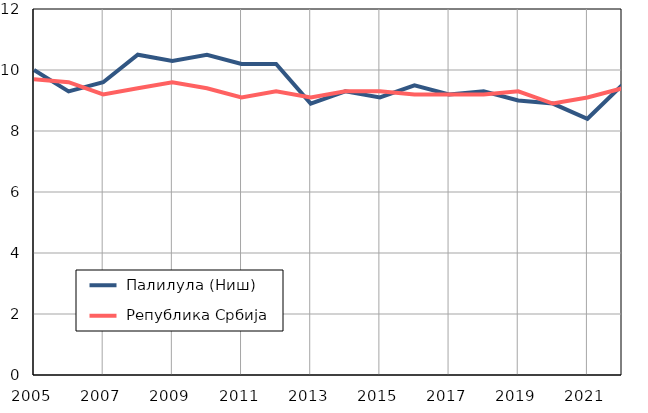
| Category |  Палилула (Ниш) |  Република Србија |
|---|---|---|
| 2005.0 | 10 | 9.7 |
| 2006.0 | 9.3 | 9.6 |
| 2007.0 | 9.6 | 9.2 |
| 2008.0 | 10.5 | 9.4 |
| 2009.0 | 10.3 | 9.6 |
| 2010.0 | 10.5 | 9.4 |
| 2011.0 | 10.2 | 9.1 |
| 2012.0 | 10.2 | 9.3 |
| 2013.0 | 8.9 | 9.1 |
| 2014.0 | 9.3 | 9.3 |
| 2015.0 | 9.1 | 9.3 |
| 2016.0 | 9.5 | 9.2 |
| 2017.0 | 9.2 | 9.2 |
| 2018.0 | 9.3 | 9.2 |
| 2019.0 | 9 | 9.3 |
| 2020.0 | 8.9 | 8.9 |
| 2021.0 | 8.4 | 9.1 |
| 2022.0 | 9.5 | 9.4 |